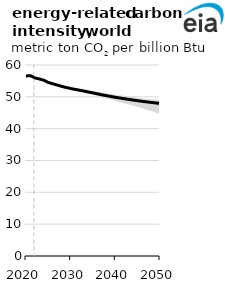
| Category | Series 1 |
|---|---|
| 2020.0 | 56.549 |
| 2021.0 | 56.651 |
| 2022.0 | 55.923 |
| 2023.0 | 55.613 |
| 2024.0 | 55.213 |
| 2025.0 | 54.512 |
| 2026.0 | 54.099 |
| 2027.0 | 53.702 |
| 2028.0 | 53.288 |
| 2029.0 | 52.922 |
| 2030.0 | 52.601 |
| 2031.0 | 52.329 |
| 2032.0 | 52.071 |
| 2033.0 | 51.794 |
| 2034.0 | 51.502 |
| 2035.0 | 51.23 |
| 2036.0 | 50.934 |
| 2037.0 | 50.646 |
| 2038.0 | 50.372 |
| 2039.0 | 50.109 |
| 2040.0 | 49.853 |
| 2041.0 | 49.634 |
| 2042.0 | 49.417 |
| 2043.0 | 49.202 |
| 2044.0 | 48.987 |
| 2045.0 | 48.78 |
| 2046.0 | 48.596 |
| 2047.0 | 48.422 |
| 2048.0 | 48.248 |
| 2049.0 | 48.085 |
| 2050.0 | 47.914 |